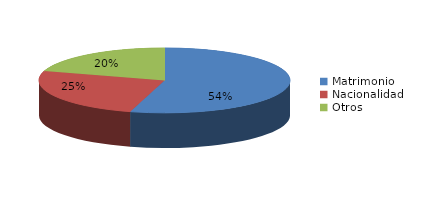
| Category | Series 0 |
|---|---|
| Matrimonio | 2206 |
| Nacionalidad | 1025 |
| Otros | 826 |